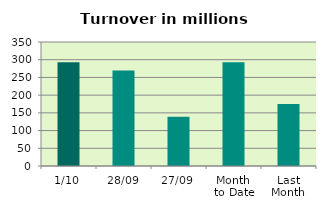
| Category | Series 0 |
|---|---|
| 1/10 | 293.081 |
| 28/09 | 269.463 |
| 27/09 | 139.007 |
| Month 
to Date | 293.081 |
| Last
Month | 174.723 |